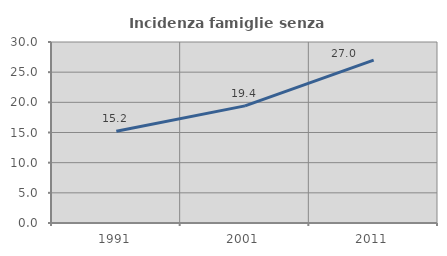
| Category | Incidenza famiglie senza nuclei |
|---|---|
| 1991.0 | 15.206 |
| 2001.0 | 19.416 |
| 2011.0 | 26.997 |